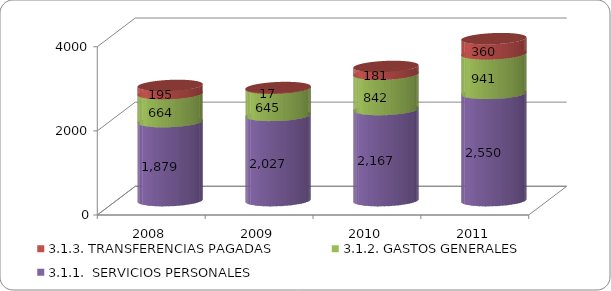
| Category | 3.1.1.  SERVICIOS PERSONALES | 3.1.2. GASTOS GENERALES | 3.1.3. TRANSFERENCIAS PAGADAS |
|---|---|---|---|
| 2008.0 | 1879.061 | 664.418 | 194.972 |
| 2009.0 | 2026.677 | 644.942 | 16.615 |
| 2010.0 | 2167.051 | 841.864 | 180.501 |
| 2011.0 | 2550 | 941 | 360 |